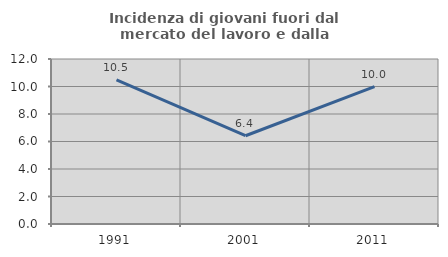
| Category | Incidenza di giovani fuori dal mercato del lavoro e dalla formazione  |
|---|---|
| 1991.0 | 10.48 |
| 2001.0 | 6.419 |
| 2011.0 | 9.984 |